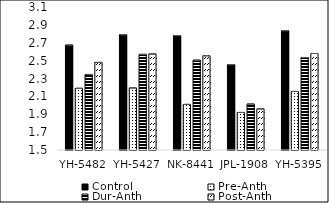
| Category | Control | Pre-Anth | Dur-Anth | Post-Anth |
|---|---|---|---|---|
| YH-5482 | 2.675 | 2.19 | 2.345 | 2.48 |
| YH-5427 | 2.79 | 2.195 | 2.57 | 2.575 |
| NK-8441 | 2.78 | 2.01 | 2.505 | 2.555 |
| JPL-1908 | 2.455 | 1.92 | 2.015 | 1.96 |
| YH-5395 | 2.835 | 2.155 | 2.535 | 2.58 |